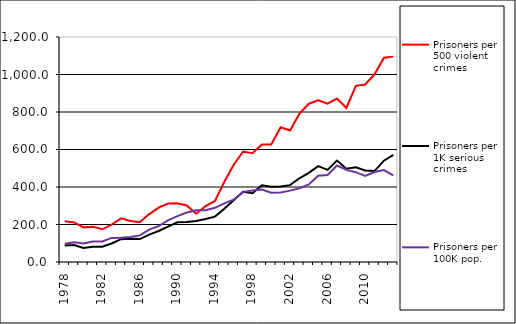
| Category | Prisoners per 500 violent crimes | Prisoners per 1K serious crimes | Prisoners per 100K pop. |
|---|---|---|---|
| 1978.0 | 217.113 | 87.486 | 96.913 |
| 1979.0 | 210.963 | 90.399 | 104.65 |
| 1980.0 | 184.739 | 75.359 | 98.531 |
| 1981.0 | 188.367 | 80.68 | 109.069 |
| 1982.0 | 174.502 | 81.788 | 109.926 |
| 1983.0 | 199.423 | 98.916 | 128.514 |
| 1984.0 | 233.03 | 121.791 | 129.465 |
| 1985.0 | 218.772 | 124.143 | 133.682 |
| 1986.0 | 212.08 | 122.43 | 141.845 |
| 1987.0 | 255.66 | 145.765 | 172.713 |
| 1988.0 | 289.767 | 165.439 | 191.32 |
| 1989.0 | 311.57 | 189.126 | 222.404 |
| 1990.0 | 313.604 | 211.559 | 244.838 |
| 1991.0 | 301.285 | 213.775 | 263.911 |
| 1992.0 | 257.721 | 218.258 | 276.005 |
| 1993.0 | 297.775 | 229.093 | 275.534 |
| 1994.0 | 325.643 | 242.097 | 289.156 |
| 1995.0 | 428.297 | 283.979 | 312.435 |
| 1996.0 | 518.557 | 329.471 | 332.389 |
| 1997.0 | 589.375 | 374.129 | 373.593 |
| 1998.0 | 580.486 | 366.368 | 380.767 |
| 1999.0 | 627.129 | 409.633 | 386.712 |
| 2000.0 | 626.691 | 400.93 | 369.121 |
| 2001.0 | 718.554 | 403.053 | 371.214 |
| 2002.0 | 701.378 | 409.876 | 380.75 |
| 2003.0 | 791.145 | 446.424 | 393.134 |
| 2004.0 | 844.169 | 475.398 | 413.826 |
| 2005.0 | 862.897 | 511.146 | 460.503 |
| 2006.0 | 844.762 | 491.388 | 463.948 |
| 2007.0 | 871.456 | 541.299 | 514.515 |
| 2008.0 | 821.654 | 497.261 | 491.123 |
| 2009.0 | 939.636 | 505.675 | 479.172 |
| 2010.0 | 946.856 | 488.185 | 459.445 |
| 2011.0 | 1001.051 | 484.832 | 479.801 |
| 2012.0 | 1089.423 | 540.311 | 490.122 |
| 2013.0 | 1095.366 | 570.891 | 462.089 |